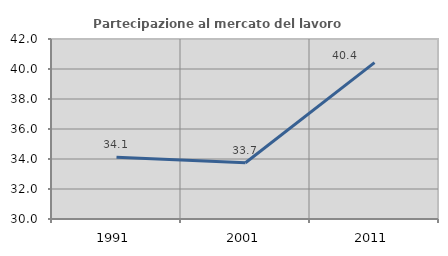
| Category | Partecipazione al mercato del lavoro  femminile |
|---|---|
| 1991.0 | 34.122 |
| 2001.0 | 33.746 |
| 2011.0 | 40.426 |